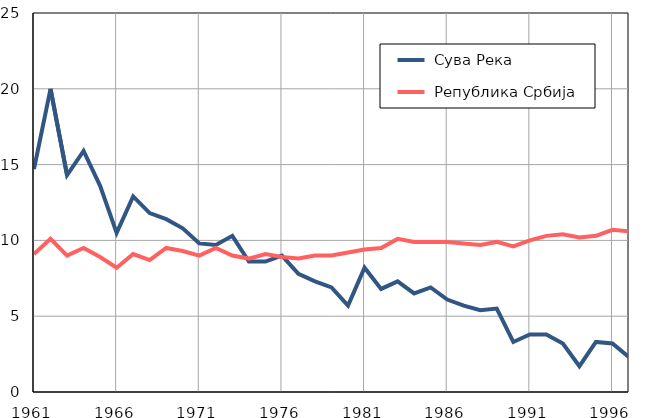
| Category |  Сува Река |  Република Србија |
|---|---|---|
| 1961.0 | 14.7 | 9.1 |
| 1962.0 | 20 | 10.1 |
| 1963.0 | 14.3 | 9 |
| 1964.0 | 15.9 | 9.5 |
| 1965.0 | 13.6 | 8.9 |
| 1966.0 | 10.5 | 8.2 |
| 1967.0 | 12.9 | 9.1 |
| 1968.0 | 11.8 | 8.7 |
| 1969.0 | 11.4 | 9.5 |
| 1970.0 | 10.8 | 9.3 |
| 1971.0 | 9.8 | 9 |
| 1972.0 | 9.7 | 9.5 |
| 1973.0 | 10.3 | 9 |
| 1974.0 | 8.6 | 8.8 |
| 1975.0 | 8.6 | 9.1 |
| 1976.0 | 9 | 8.9 |
| 1977.0 | 7.8 | 8.8 |
| 1978.0 | 7.3 | 9 |
| 1979.0 | 6.9 | 9 |
| 1980.0 | 5.7 | 9.2 |
| 1981.0 | 8.2 | 9.4 |
| 1982.0 | 6.8 | 9.5 |
| 1983.0 | 7.3 | 10.1 |
| 1984.0 | 6.5 | 9.9 |
| 1985.0 | 6.9 | 9.9 |
| 1986.0 | 6.1 | 9.9 |
| 1987.0 | 5.7 | 9.8 |
| 1988.0 | 5.4 | 9.7 |
| 1989.0 | 5.5 | 9.9 |
| 1990.0 | 3.3 | 9.6 |
| 1991.0 | 3.8 | 10 |
| 1992.0 | 3.8 | 10.3 |
| 1993.0 | 3.2 | 10.4 |
| 1994.0 | 1.7 | 10.2 |
| 1995.0 | 3.3 | 10.3 |
| 1996.0 | 3.2 | 10.7 |
| 1997.0 | 2.3 | 10.6 |